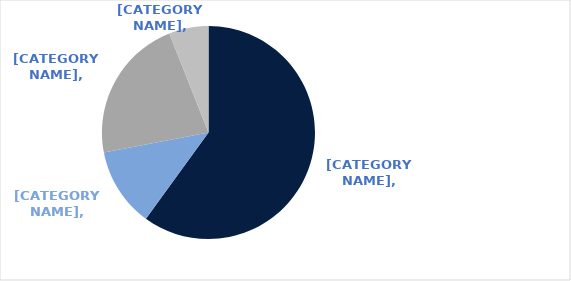
| Category | Series 0 |
|---|---|
| Office | 0.6 |
| Industrial | 0.12 |
| Retail | 0.22 |
| Build to Rent | 0.06 |